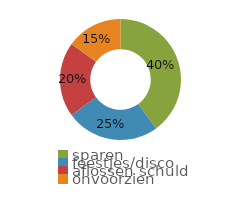
| Category | Series 0 |
|---|---|
| sparen | 0.4 |
| feestjes/disco | 0.25 |
| aflossen schuld | 0.2 |
| onvoorzien | 0.15 |